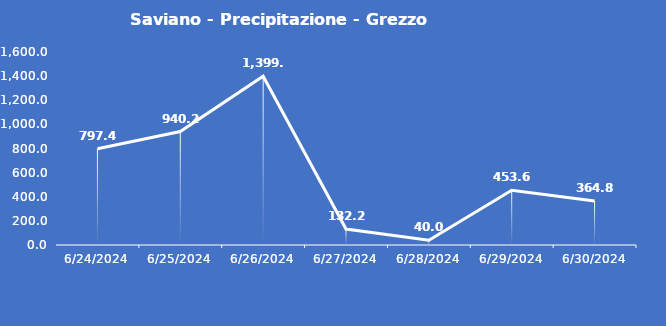
| Category | Saviano - Precipitazione - Grezzo (mm) |
|---|---|
| 6/24/24 | 797.4 |
| 6/25/24 | 940.2 |
| 6/26/24 | 1399.4 |
| 6/27/24 | 132.2 |
| 6/28/24 | 40 |
| 6/29/24 | 453.6 |
| 6/30/24 | 364.8 |